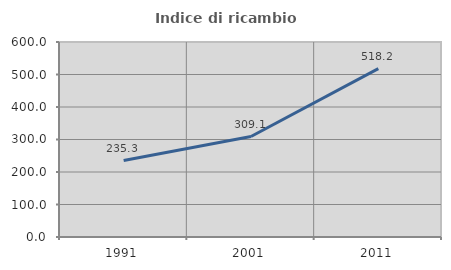
| Category | Indice di ricambio occupazionale  |
|---|---|
| 1991.0 | 235.294 |
| 2001.0 | 309.091 |
| 2011.0 | 518.182 |